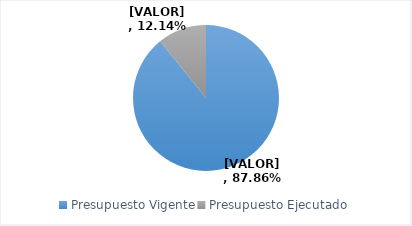
| Category | Series 0 |
|---|---|
| Presupuesto Vigente | 200974100 |
| Presupuesto Ejecutado | 24402698.89 |